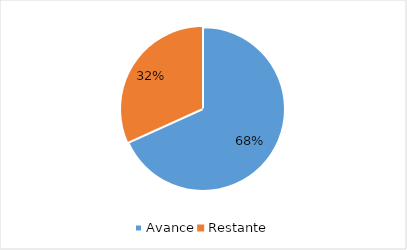
| Category | Series 0 |
|---|---|
| Avance | 0.682 |
| Restante | 0.318 |